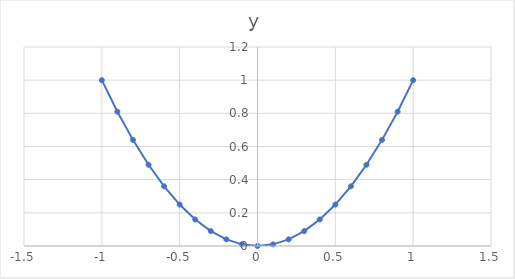
| Category | y |
|---|---|
| -1.0 | 1 |
| -0.9 | 0.81 |
| -0.8 | 0.64 |
| -0.7000000000000001 | 0.49 |
| -0.6000000000000001 | 0.36 |
| -0.5000000000000001 | 0.25 |
| -0.40000000000000013 | 0.16 |
| -0.30000000000000016 | 0.09 |
| -0.20000000000000015 | 0.04 |
| -0.10000000000000014 | 0.01 |
| -1.3877787807814457e-16 | 0 |
| 0.09999999999999987 | 0.01 |
| 0.19999999999999987 | 0.04 |
| 0.2999999999999999 | 0.09 |
| 0.3999999999999999 | 0.16 |
| 0.4999999999999999 | 0.25 |
| 0.5999999999999999 | 0.36 |
| 0.6999999999999998 | 0.49 |
| 0.7999999999999998 | 0.64 |
| 0.8999999999999998 | 0.81 |
| 0.9999999999999998 | 1 |